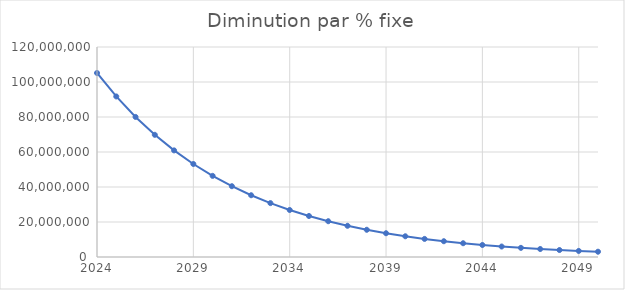
| Category | Emissions (t eqCO2) |
|---|---|
| 2024.0 | 105153500 |
| 2025.0 | 91739472.784 |
| 2026.0 | 80036621.383 |
| 2027.0 | 69826657.687 |
| 2028.0 | 60919139.757 |
| 2029.0 | 53147919.601 |
| 2030.0 | 46368044.086 |
| 2031.0 | 40453051.191 |
| 2032.0 | 35292611.171 |
| 2033.0 | 30790468.619 |
| 2034.0 | 26862647.063 |
| 2035.0 | 23435882.582 |
| 2036.0 | 20446257.256 |
| 2037.0 | 17838006.923 |
| 2038.0 | 15562481.046 |
| 2039.0 | 13577235.245 |
| 2040.0 | 11845239.609 |
| 2041.0 | 10334187.99 |
| 2042.0 | 9015895.408 |
| 2043.0 | 7865772.337 |
| 2044.0 | 6862366.038 |
| 2045.0 | 5986960.419 |
| 2046.0 | 5223226.925 |
| 2047.0 | 4556919.972 |
| 2048.0 | 3975611.233 |
| 2049.0 | 3468457.812 |
| 2050.0 | 3026000 |